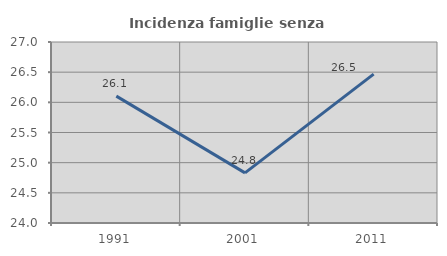
| Category | Incidenza famiglie senza nuclei |
|---|---|
| 1991.0 | 26.102 |
| 2001.0 | 24.831 |
| 2011.0 | 26.467 |